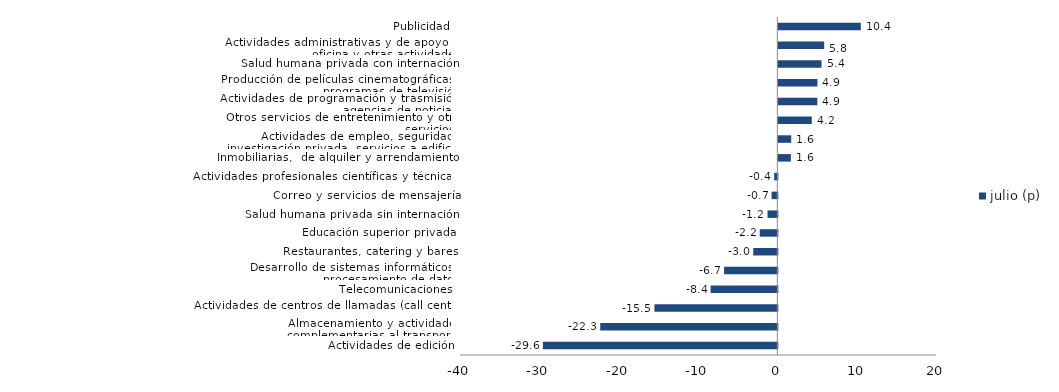
| Category | julio (p) |
|---|---|
| Actividades de edición | -29.556 |
| Almacenamiento y actividades complementarias al transporte | -22.325 |
| Actividades de centros de llamadas (call center) | -15.492 |
| Telecomunicaciones | -8.407 |
| Desarrollo de sistemas informáticos y procesamiento de datos | -6.71 |
| Restaurantes, catering y bares | -3.035 |
| Educación superior privada | -2.217 |
| Salud humana privada sin internación | -1.24 |
| Correo y servicios de mensajería | -0.727 |
| Actividades profesionales científicas y técnicas  | -0.398 |
| Inmobiliarias,  de alquiler y arrendamiento  | 1.582 |
| Actividades de empleo, seguridad e investigación privada, servicios a edificios | 1.625 |
| Otros servicios de entretenimiento y otros servicios | 4.216 |
| Actividades de programación y trasmisión,  agencias de noticias | 4.919 |
| Producción de películas cinematográficas y programas de televisión | 4.928 |
| Salud humana privada con internación | 5.442 |
| Actividades administrativas y de apoyo de oficina y otras actividades | 5.781 |
| Publicidad | 10.399 |